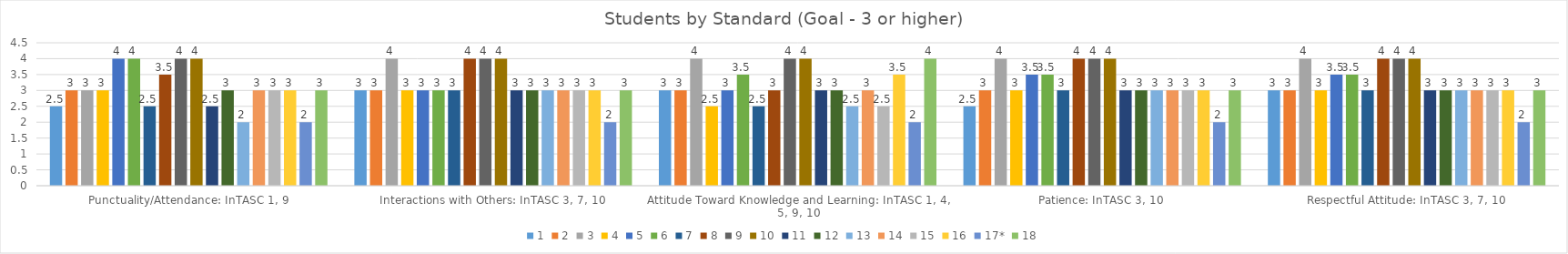
| Category | 1 | 2 | 3 | 4 | 5 | 6 | 7 | 8 | 9 | 10 | 11 | 12 | 13 | 14 | 15 | 16 | 17* | 18 |
|---|---|---|---|---|---|---|---|---|---|---|---|---|---|---|---|---|---|---|
| Punctuality/Attendance: InTASC 1, 9 | 2.5 | 3 | 3 | 3 | 4 | 4 | 2.5 | 3.5 | 4 | 4 | 2.5 | 3 | 2 | 3 | 3 | 3 | 2 | 3 |
| Interactions with Others: InTASC 3, 7, 10 | 3 | 3 | 4 | 3 | 3 | 3 | 3 | 4 | 4 | 4 | 3 | 3 | 3 | 3 | 3 | 3 | 2 | 3 |
| Attitude Toward Knowledge and Learning: InTASC 1, 4, 5, 9, 10 | 3 | 3 | 4 | 2.5 | 3 | 3.5 | 2.5 | 3 | 4 | 4 | 3 | 3 | 2.5 | 3 | 2.5 | 3.5 | 2 | 4 |
| Patience: InTASC 3, 10 | 2.5 | 3 | 4 | 3 | 3.5 | 3.5 | 3 | 4 | 4 | 4 | 3 | 3 | 3 | 3 | 3 | 3 | 2 | 3 |
| Respectful Attitude: InTASC 3, 7, 10 | 3 | 3 | 4 | 3 | 3.5 | 3.5 | 3 | 4 | 4 | 4 | 3 | 3 | 3 | 3 | 3 | 3 | 2 | 3 |